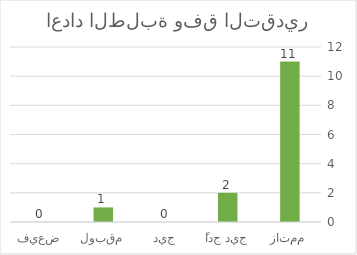
| Category | Series 0 |
|---|---|
| ممتاز | 11 |
| جيد جداً | 2 |
| جيد | 0 |
| مقبول | 1 |
| ضعيف | 0 |